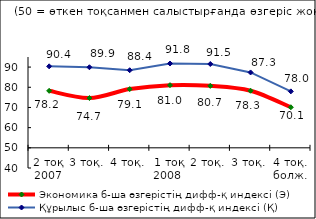
| Category | Экономика б-ша өзгерістің дифф-қ индексі (Э) | Құрылыс б-ша өзгерістің дифф-қ индексі (Қ) |
|---|---|---|
| 2 тоқ 2007 | 78.235 | 90.375 |
| 3 тоқ. | 74.655 | 89.915 |
| 4 тоқ. | 79.095 | 88.445 |
| 1 тоқ 2008  | 81.045 | 91.77 |
| 2 тоқ. | 80.695 | 91.525 |
| 3 тоқ. | 78.275 | 87.345 |
| 4 тоқ. болж. | 70.095 | 77.965 |